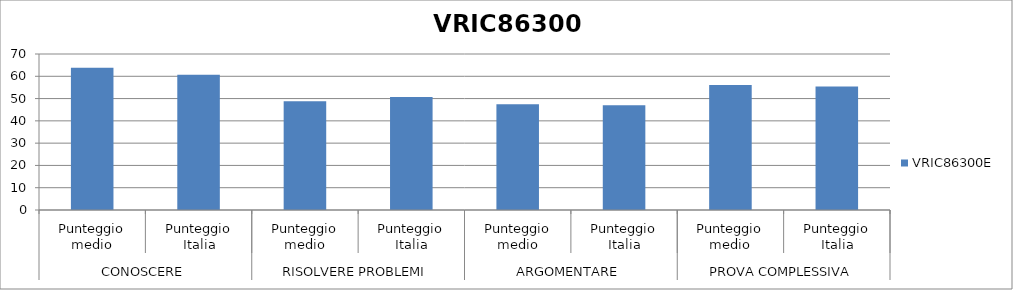
| Category | VRIC86300E |
|---|---|
| 0 | 63.8 |
| 1 | 60.7 |
| 2 | 48.8 |
| 3 | 50.7 |
| 4 | 47.4 |
| 5 | 47 |
| 6 | 56.1 |
| 7 | 55.4 |